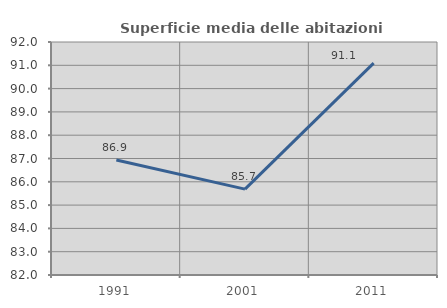
| Category | Superficie media delle abitazioni occupate |
|---|---|
| 1991.0 | 86.937 |
| 2001.0 | 85.684 |
| 2011.0 | 91.091 |